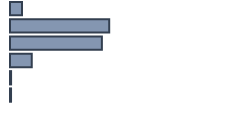
| Category | Series 0 |
|---|---|
| 0 | 5.331 |
| 1 | 43.703 |
| 2 | 40.477 |
| 3 | 9.556 |
| 4 | 0.475 |
| 5 | 0.458 |
| 6 | 0 |